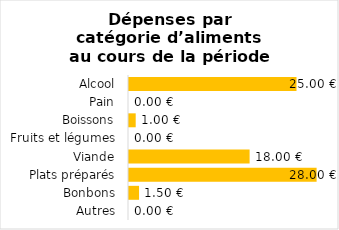
| Category | Dépenses |
|---|---|
| Alcool | 25 |
| Pain | 0 |
| Boissons | 1 |
| Fruits et légumes | 0 |
| Viande | 18 |
| Plats préparés | 28 |
| Bonbons | 1.5 |
| Autres | 0 |